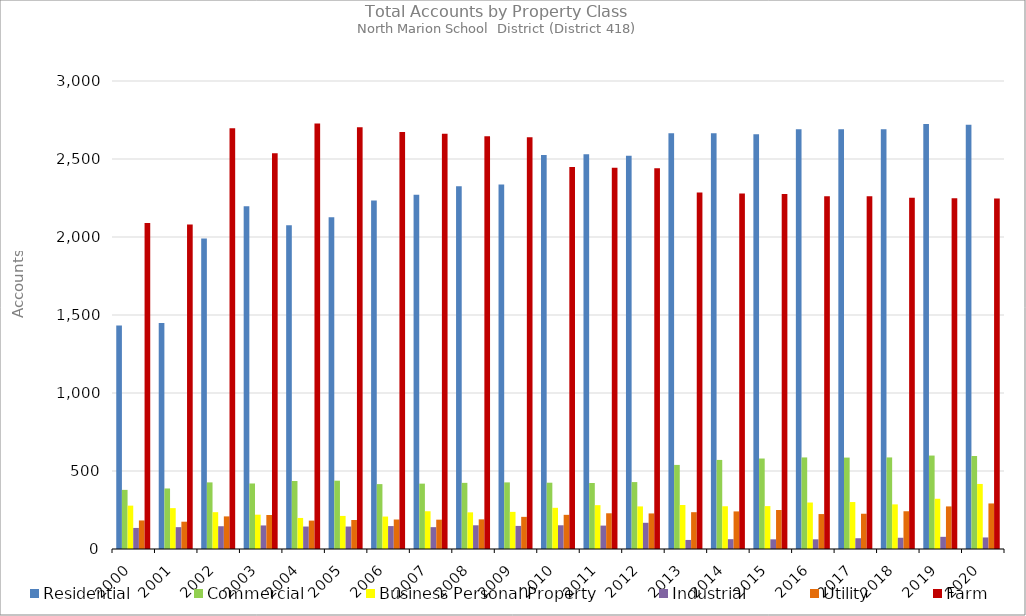
| Category | Residential | Commercial | Business Personal Property | Industrial | Utility | Farm |
|---|---|---|---|---|---|---|
| 2000.0 | 1432 | 379 | 278 | 135 | 183 | 2090 |
| 2001.0 | 1449 | 388 | 262 | 140 | 175 | 2080 |
| 2002.0 | 1991 | 427 | 236 | 146 | 209 | 2697 |
| 2003.0 | 2197 | 420 | 220 | 151 | 218 | 2537 |
| 2004.0 | 2076 | 436 | 199 | 144 | 182 | 2727 |
| 2005.0 | 2126 | 438 | 212 | 144 | 186 | 2703 |
| 2006.0 | 2234 | 416 | 208 | 147 | 189 | 2673 |
| 2007.0 | 2271 | 419 | 242 | 140 | 188 | 2662 |
| 2008.0 | 2326 | 424 | 235 | 152 | 190 | 2646 |
| 2009.0 | 2337 | 427 | 238 | 148 | 206 | 2640 |
| 2010.0 | 2525 | 425 | 264 | 152 | 219 | 2448 |
| 2011.0 | 2530 | 423 | 281 | 150 | 229 | 2444 |
| 2012.0 | 2521 | 429 | 273 | 168 | 228 | 2440 |
| 2013.0 | 2665 | 539 | 282 | 58 | 236 | 2286 |
| 2014.0 | 2665 | 571 | 274 | 63 | 241 | 2279 |
| 2015.0 | 2658 | 580 | 275 | 62 | 250 | 2276 |
| 2016.0 | 2690 | 587 | 298 | 62 | 224 | 2262 |
| 2017.0 | 2690 | 586 | 301 | 69 | 226 | 2261 |
| 2018.0 | 2690 | 587 | 286 | 72 | 242 | 2252 |
| 2019.0 | 2725 | 599 | 322 | 78 | 273 | 2248 |
| 2020.0 | 2720 | 596 | 417 | 74 | 292 | 2246 |